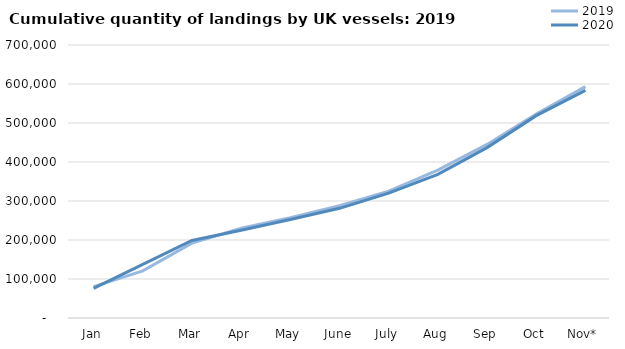
| Category | 2019 | 2020 |
|---|---|---|
| Jan | 80449.291 | 76070.432 |
| Feb | 121010.956 | 137469.636 |
| Mar | 191950.174 | 198850.507 |
| Apr | 229953.665 | 225030.118 |
| May | 257093.368 | 252514.053 |
| June | 287897.579 | 281245.868 |
| July | 325295.935 | 320301.207 |
| Aug | 379258.977 | 368159.711 |
| Sep | 445010.558 | 436951.487 |
| Oct | 522875.566 | 518812.345 |
| Nov* | 593385.793 | 583438.742 |